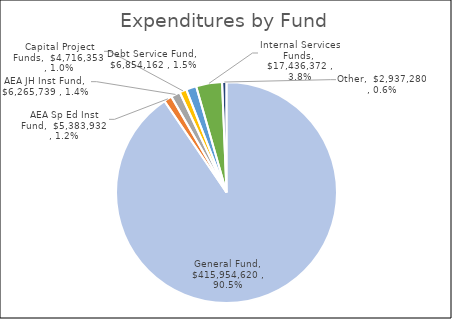
| Category | Series 0 |
|---|---|
| General Fund | 415954619.95 |
| AEA Sp Ed Inst Fund | 5383932.06 |
| AEA JH Inst Fund | 6265739.01 |
| Capital Project Funds | 4716352.86 |
| Debt Service Fund | 6854162.15 |
| Internal Services Funds | 17436371.94 |
| Other | 2937279.98 |